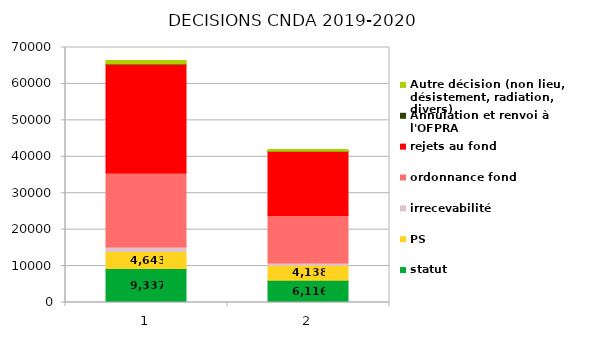
| Category | statut | PS | irrecevabilité | ordonnance fond | rejets au fond | Annulation et renvoi à l'OFPRA  | Autre décision (non lieu, désistement, radiation, divers) |
|---|---|---|---|---|---|---|---|
| 0 | 9337 | 4643 | 1245 | 20321 | 29833 | 84 | 1001 |
| 1 | 6116 | 4138 | 597 | 13021 | 17619 | 61 | 473 |